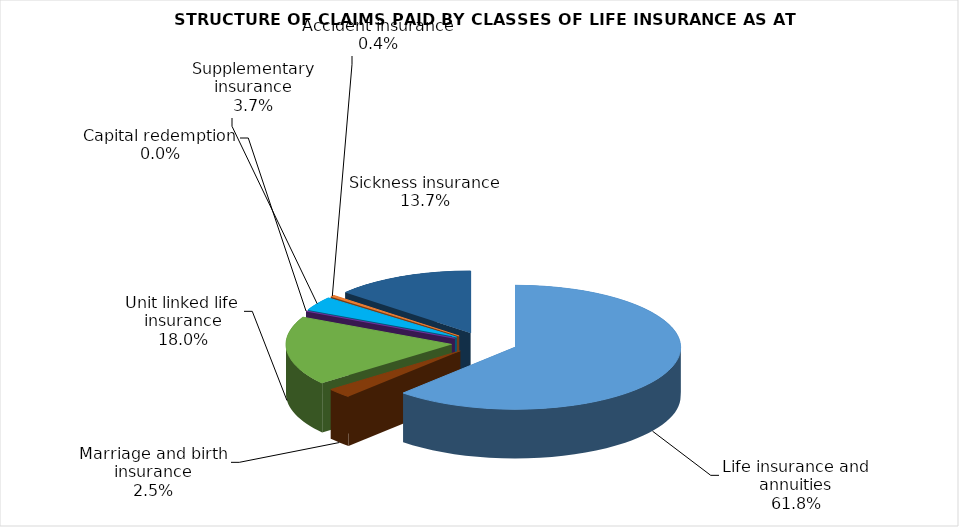
| Category | Life insurance and annuities |
|---|---|
| Life insurance and annuities | 35326902.017 |
| Marriage and birth insurance | 1422254.344 |
| Unit linked life insurance | 10269406.108 |
| Capital redemption | 0 |
| Supplementary insurance | 2088611.377 |
| Accident insurance | 255500.64 |
| Sickness insurance | 7807234.06 |